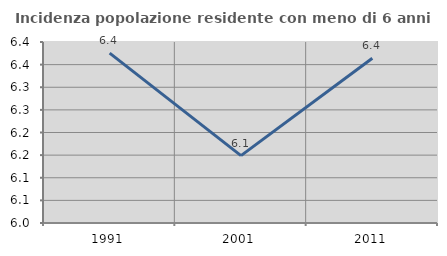
| Category | Incidenza popolazione residente con meno di 6 anni |
|---|---|
| 1991.0 | 6.375 |
| 2001.0 | 6.149 |
| 2011.0 | 6.364 |